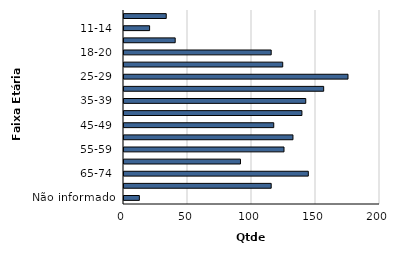
| Category | Qtde Vítimas |
|---|---|
| Não informado | 12 |
| 75+ | 115 |
| 65-74 | 144 |
| 60-64 | 91 |
| 55-59 | 125 |
| 50-54 | 132 |
| 45-49 | 117 |
| 40-44 | 139 |
| 35-39 | 142 |
| 30-34 | 156 |
| 25-29 | 175 |
| 21-24 | 124 |
| 18-20 | 115 |
| 15-17 | 40 |
| 11-14 | 20 |
| 0-10 | 33 |